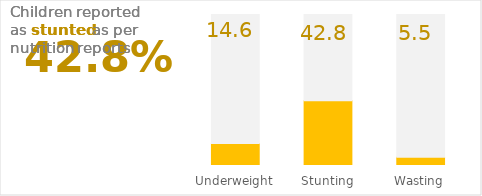
| Category | Sector | Series 1 |
|---|---|---|
| Underweight | 14.6 | 85.4 |
| Stunting | 42.8 | 57.2 |
| Wasting | 5.5 | 94.5 |